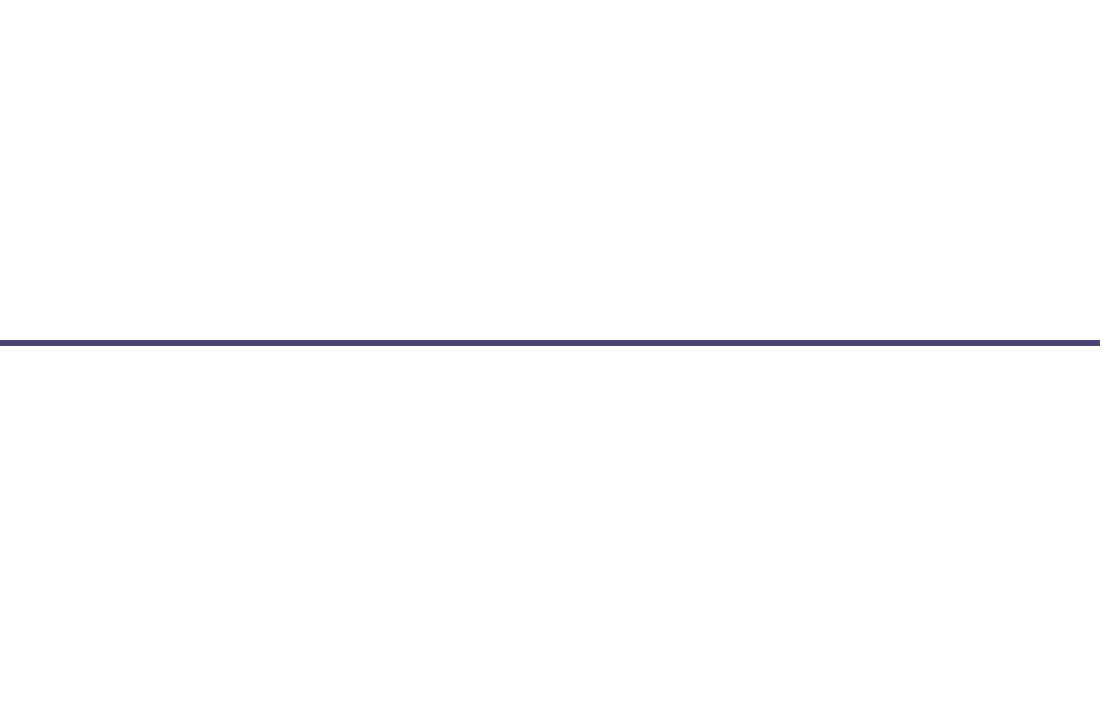
| Category | Posição |
|---|---|
| 0 | 1 |
| 1 | -2 |
| 2 | 1 |
| 3 | -1 |
| 4 | -0.5 |
| 5 | 2 |
| 6 | 0.5 |
| 7 | -1 |
| 8 | 0.5 |
| 9 | -2 |